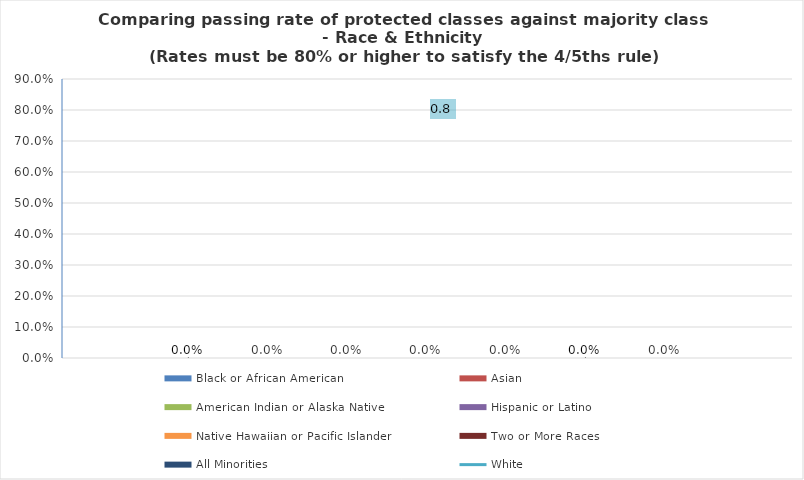
| Category | Black or African American  | Asian | American Indian or Alaska Native | Hispanic or Latino | Native Hawaiian or Pacific Islander | Two or More Races | All Minorities |
|---|---|---|---|---|---|---|---|
| Must be 80% or greater to satisfy 4/5ths rule | 0 | 0 | 0 | 0 | 0 | 0 | 0 |